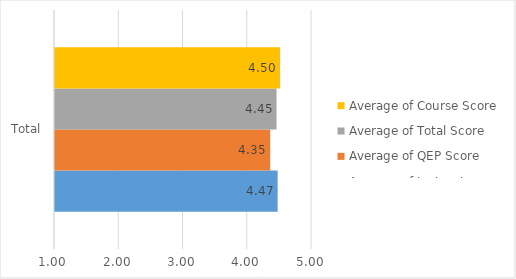
| Category | Average of Instructor Score | Average of QEP Score | Average of Total Score | Average of Course Score |
|---|---|---|---|---|
| Total | 4.465 | 4.35 | 4.448 | 4.504 |